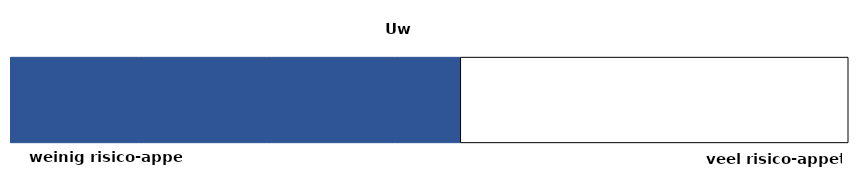
| Category | beleggingsvoorkeur | reactie bij sterke daling | gevoeligheid voor schommelingen | mogelijkheid om verlies op te vangen | maximale score |
|---|---|---|---|---|---|
| 0 | 0.165 | 0.165 | 0.165 | 0.085 | 0.5 |